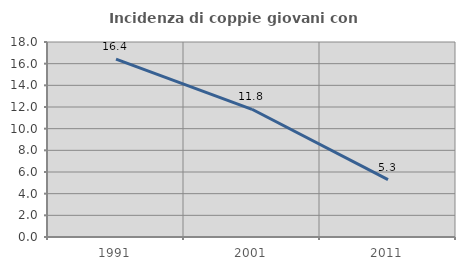
| Category | Incidenza di coppie giovani con figli |
|---|---|
| 1991.0 | 16.412 |
| 2001.0 | 11.789 |
| 2011.0 | 5.291 |